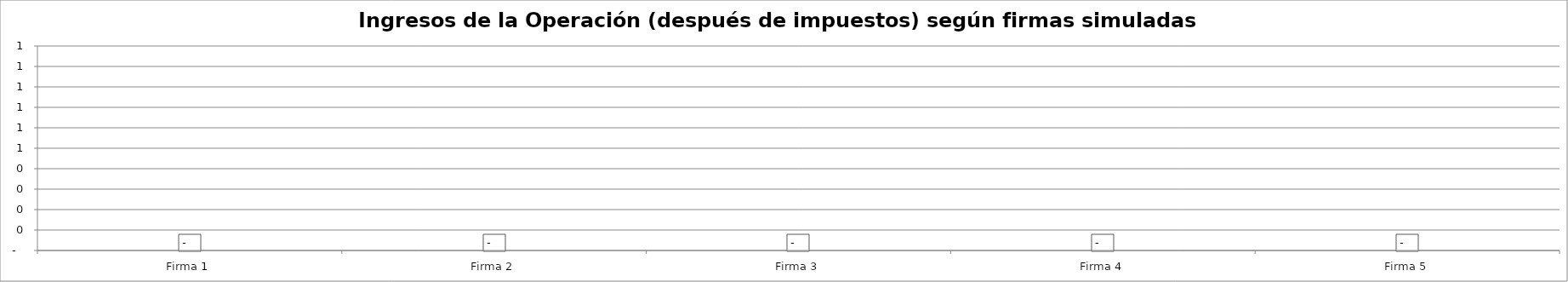
| Category | Ingresos de la Operación (después de impuestos) según firmas simuladas - Año 10 |
|---|---|
| Firma 1 | 0 |
| Firma 2 | 0 |
| Firma 3 | 0 |
| Firma 4 | 0 |
| Firma 5 | 0 |